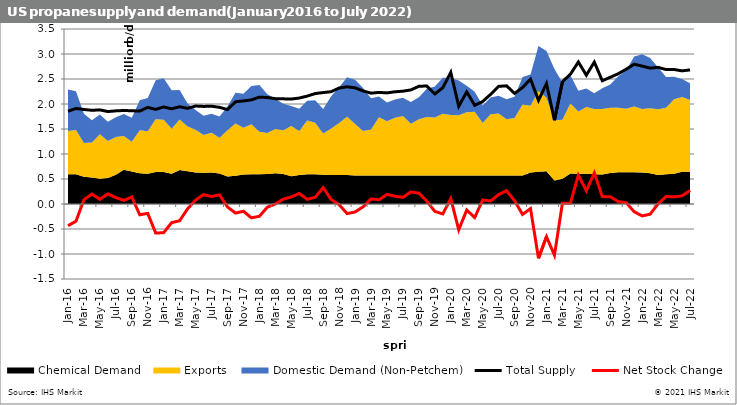
| Category | Total Supply  | Net Stock Change  |
|---|---|---|
| 2016-01-15 | 1854225.806 | -433807.116 |
| 2016-02-15 | 1910482.759 | -344954.67 |
| 2016-03-15 | 1890225.806 | 86050.25 |
| 2016-04-15 | 1873600 | 198952.211 |
| 2016-05-15 | 1882548.387 | 93436.076 |
| 2016-06-15 | 1848600 | 202097.179 |
| 2016-07-15 | 1862903.226 | 128000.653 |
| 2016-08-15 | 1870387.097 | 71346.679 |
| 2016-09-15 | 1864706.768 | 140225.543 |
| 2016-10-15 | 1858399.241 | -215469.31 |
| 2016-11-15 | 1931774.435 | -187649.831 |
| 2016-12-15 | 1892723.822 | -581602.206 |
| 2017-01-15 | 1940660.306 | -573193.799 |
| 2017-02-15 | 1903811.882 | -373222.104 |
| 2017-03-15 | 1945275.209 | -334968.793 |
| 2017-04-15 | 1913879.435 | -95813.261 |
| 2017-05-15 | 1959309.467 | 77208.867 |
| 2017-06-15 | 1951800 | 187163.175 |
| 2017-07-15 | 1955322.581 | 150049.568 |
| 2017-08-15 | 1933502.995 | 183306.717 |
| 2017-09-15 | 1889012.292 | -58747.056 |
| 2017-10-15 | 2044548.039 | -181259.869 |
| 2017-11-15 | 2061739.689 | -144973.162 |
| 2017-12-15 | 2082480.728 | -276523.83 |
| 2018-01-15 | 2136186.681 | -246022.32 |
| 2018-02-15 | 2129518.597 | -63768.988 |
| 2018-03-15 | 2107041.91 | 624.423 |
| 2018-04-15 | 2103183.039 | 98079.833 |
| 2018-05-15 | 2099118.681 | 140529.386 |
| 2018-06-15 | 2118679.02 | 211362.552 |
| 2018-07-15 | 2158189.955 | 92753.004 |
| 2018-08-15 | 2208832.825 | 133843.142 |
| 2018-09-15 | 2228889.941 | 327040.31 |
| 2018-10-15 | 2246171.603 | 90221.547 |
| 2018-11-15 | 2319715.176 | -13701.306 |
| 2018-12-15 | 2344218.297 | -191915.327 |
| 2019-01-15 | 2323381.599 | -159214.638 |
| 2019-02-15 | 2262188.646 | -56891.146 |
| 2019-03-15 | 2216760.238 | 102679.047 |
| 2019-04-15 | 2232300.624 | 83258.594 |
| 2019-05-15 | 2222084.98 | 192367.44 |
| 2019-06-15 | 2244446.543 | 156312.921 |
| 2019-07-15 | 2256431.088 | 133095.439 |
| 2019-08-15 | 2281871.665 | 241835.108 |
| 2019-09-15 | 2354193.174 | 217307.813 |
| 2019-10-15 | 2360246.456 | 55913.839 |
| 2019-11-15 | 2201236.179 | -147668.356 |
| 2019-12-15 | 2325011.149 | -198508.845 |
| 2020-01-15 | 2632747.32 | 108797.312 |
| 2020-02-15 | 1954350.964 | -517414.374 |
| 2020-03-15 | 2242158.215 | -120416.049 |
| 2020-04-15 | 1973767.61 | -271524.439 |
| 2020-05-15 | 2050244.666 | 81071.123 |
| 2020-06-15 | 2193145.085 | 60654.747 |
| 2020-07-15 | 2352622.858 | 186495.677 |
| 2020-08-15 | 2363475.864 | 266202.302 |
| 2020-09-15 | 2211912.249 | 65532.65 |
| 2020-10-15 | 2328895.052 | -208835.436 |
| 2020-11-15 | 2497090.158 | -92349.283 |
| 2020-12-15 | 2073057.308 | -1086379.933 |
| 2021-01-15 | 2408047.117 | -654321.284 |
| 2021-02-15 | 1675276.512 | -1022765.081 |
| 2021-03-15 | 2445204.675 | 15252.158 |
| 2021-04-15 | 2594947.136 | 17500.677 |
| 2021-05-15 | 2839728.91 | 575493.006 |
| 2021-06-15 | 2576192.514 | 265016.756 |
| 2021-07-15 | 2838212.583 | 622735.618 |
| 2021-08-15 | 2464683.737 | 148101.357 |
| 2021-09-15 | 2534635.178 | 146005.404 |
| 2021-10-15 | 2605104.985 | 47628.784 |
| 2021-11-15 | 2695825.089 | 25910.881 |
| 2021-12-15 | 2795258.235 | -155773.208 |
| 2022-01-15 | 2758410.516 | -237945.923 |
| 2022-02-15 | 2717608.163 | -203625.948 |
| 2022-03-15 | 2732983.839 | 2208.366 |
| 2022-04-15 | 2687603.253 | 149735.125 |
| 2022-05-15 | 2689953.157 | 142796.769 |
| 2022-06-15 | 2662827.613 | 163405.791 |
| 2022-07-15 | 2682123.545 | 269319.47 |